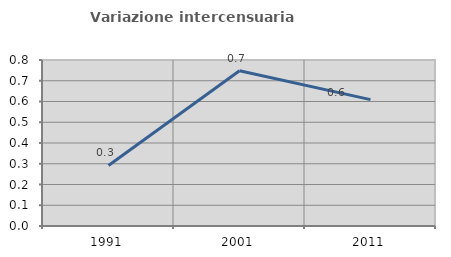
| Category | Variazione intercensuaria annua |
|---|---|
| 1991.0 | 0.292 |
| 2001.0 | 0.748 |
| 2011.0 | 0.609 |